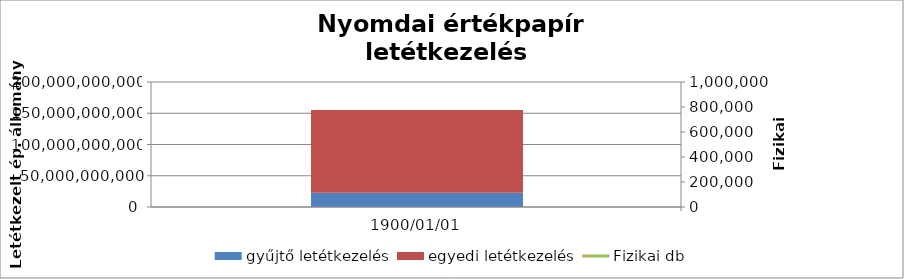
| Category | gyűjtő letétkezelés | egyedi letétkezelés |
|---|---|---|
| 2008.12.31 | 47705931350 | 123025231842.13 |
| 2009.12.31 | 52522669700 | 131777865041.01 |
| 2010.12.31 | 39587625100 | 193970088335.95 |
| 2011.12.31 | 25878550505 | 161040561475 |
| 2012.12.31 | 22928712500 | 132224845953 |